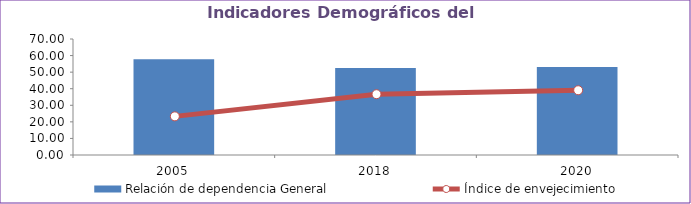
| Category | Relación de dependencia General |
|---|---|
| 2005.0 | 57.724 |
| 2018.0 | 52.465 |
| 2020.0 | 53.164 |